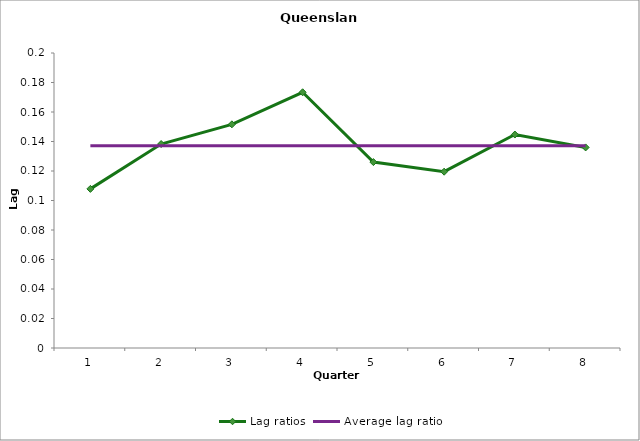
| Category | Lag ratios | Average lag ratio |
|---|---|---|
| 0 | 0.108 | 0.137 |
| 1 | 0.138 | 0.137 |
| 2 | 0.152 | 0.137 |
| 3 | 0.173 | 0.137 |
| 4 | 0.126 | 0.137 |
| 5 | 0.12 | 0.137 |
| 6 | 0.145 | 0.137 |
| 7 | 0.136 | 0.137 |